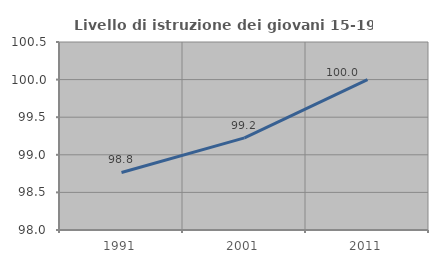
| Category | Livello di istruzione dei giovani 15-19 anni |
|---|---|
| 1991.0 | 98.765 |
| 2001.0 | 99.225 |
| 2011.0 | 100 |